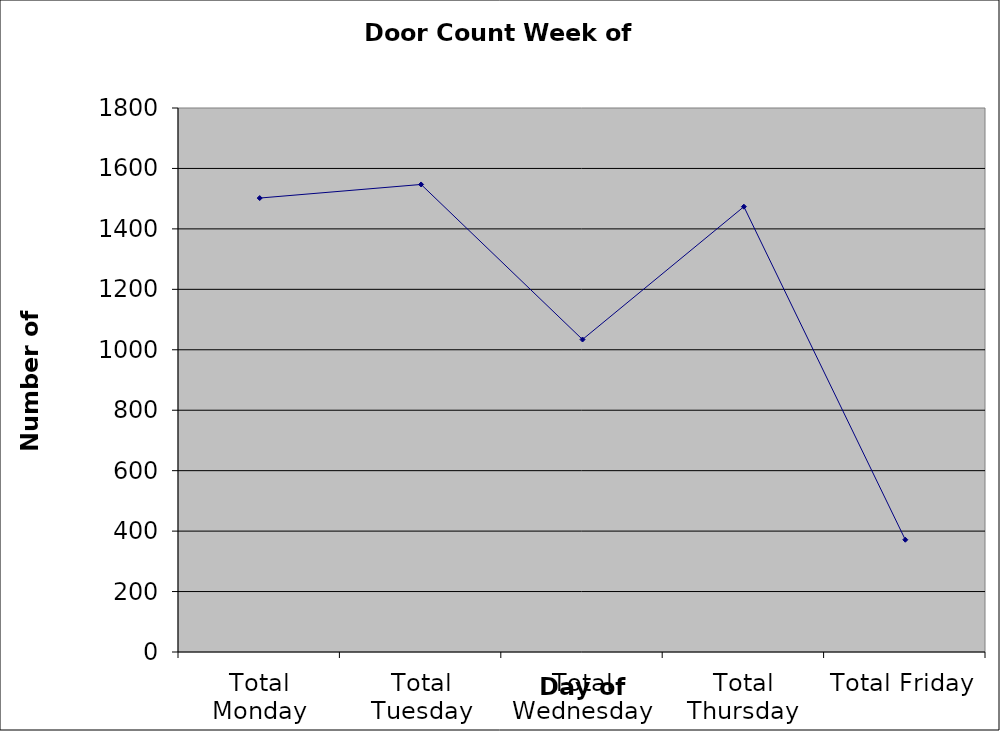
| Category | Series 0 |
|---|---|
| Total Monday | 1502 |
| Total Tuesday | 1547 |
| Total Wednesday | 1034 |
| Total Thursday | 1473.5 |
| Total Friday | 371.5 |